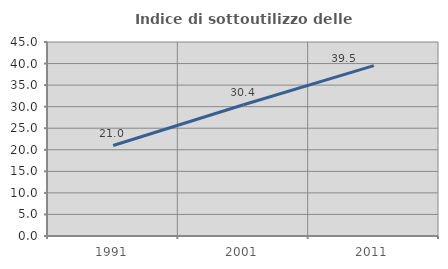
| Category | Indice di sottoutilizzo delle abitazioni  |
|---|---|
| 1991.0 | 20.985 |
| 2001.0 | 30.446 |
| 2011.0 | 39.506 |